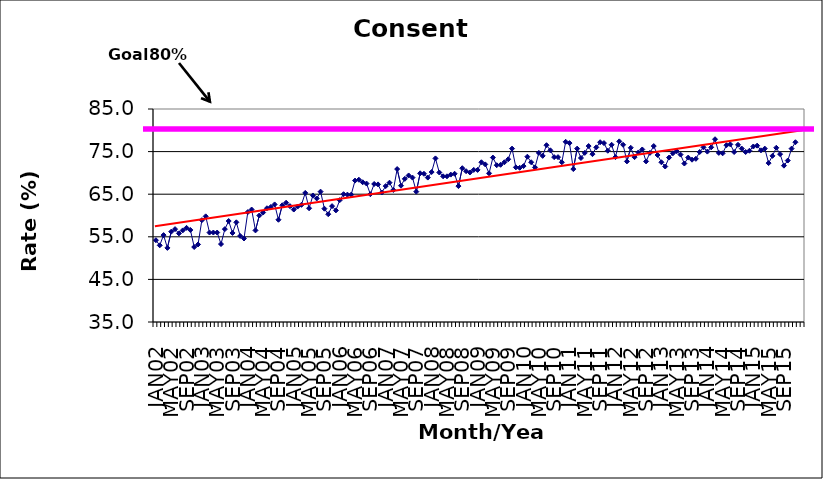
| Category | Series 0 |
|---|---|
| JAN02 | 54.2 |
| FEB02 | 53 |
| MAR02 | 55.4 |
| APR02 | 52.4 |
| MAY02 | 56.2 |
| JUN02 | 56.8 |
| JUL02 | 55.8 |
| AUG02 | 56.5 |
| SEP02 | 57.1 |
| OCT02 | 56.6 |
| NOV02 | 52.6 |
| DEC02 | 53.2 |
| JAN03 | 58.9 |
| FEB03 | 59.8 |
| MAR03 | 56 |
| APR03 | 56 |
| MAY03 | 56 |
| JUN03 | 53.3 |
| JUL03 | 56.8 |
| AUG03 | 58.7 |
| SEP03 | 55.9 |
| OCT03 | 58.4 |
| NOV03 | 55.2 |
| DEC03 | 54.6 |
| JAN04 | 60.8 |
| FEB04 | 61.4 |
| MAR04 | 56.5 |
| APR04 | 60 |
| MAY04 | 60.7 |
| JUN04 | 61.7 |
| JUL04 | 62 |
| AUG04 | 62.6 |
| SEP04 | 59 |
| OCT04 | 62.4 |
| NOV04 | 63 |
| DEC04 | 62.2 |
| JAN05 | 61.4 |
| FEB05 | 62.1 |
| MAR05 | 62.5 |
| APR05 | 65.3 |
| MAY05 | 61.7 |
| JUN05 | 64.7 |
| JUL05 | 64 |
| AUG05 | 65.6 |
| SEP05 | 61.6 |
| OCT05 | 60.3 |
| NOV05 | 62.2 |
| DEC05 | 61.2 |
| JAN06 | 63.6 |
| FEB06 | 65 |
| MAR06 | 64.9 |
| APR06 | 64.9 |
| MAY06 | 68.2 |
| JUN06 | 68.4 |
| JUL06 | 67.8 |
| AUG06 | 67.5 |
| SEP06 | 65 |
| OCT06 | 67.4 |
| NOV06 | 67.3 |
| DEC06 | 65.4 |
| JAN07 | 66.9 |
| FEB07 | 67.7 |
| MAR07 | 66 |
| APR07 | 70.9 |
| MAY07 | 67 |
| JUN07 | 68.6 |
| JUL07 | 69.4 |
| AUG07 | 68.9 |
| SEP07 | 65.6 |
| OCT07 | 69.9 |
| NOV07 | 69.8 |
| DEC07 | 68.9 |
| JAN08 | 70.2 |
| FEB08 | 73.4 |
| MAR08 | 70.1 |
| APR08 | 69.2 |
| MAY08 | 69.2 |
| JUN08 | 69.6 |
| JUL08 | 69.8 |
| AUG08 | 66.9 |
| SEP08 | 71.1 |
| OCT08 | 70.4 |
| NOV08 | 70.1 |
| DEC08 | 70.7 |
| JAN09 | 70.7 |
| FEB09 | 72.5 |
| MAR09 | 72 |
| APR09 | 69.9 |
| MAY09 | 73.6 |
| JUN09 | 71.8 |
| JUL09 | 71.9 |
| AUG09 | 72.5 |
| SEP09 | 73.2 |
| OCT09 | 75.7 |
| NOV09 | 71.3 |
| DEC09 | 71.2 |
| JAN10 | 71.6 |
| FEB10 | 73.8 |
| MAR10 | 72.5 |
| APR10 | 71.3 |
| MAY10 | 74.7 |
| JUN10 | 74 |
| JUL10 | 76.5 |
| AUG10 | 75.3 |
| SEP10 | 73.7 |
| OCT10 | 73.7 |
| NOV10 | 72.5 |
| DEC10 | 77.3 |
| JAN11 | 77 |
| FEB11 | 70.9 |
| MAR11 | 75.7 |
| APR11 | 73.5 |
| MAY11 | 74.7 |
| JUN11 | 76.3 |
| JUL11 | 74.4 |
| AUG11 | 76 |
| SEP11 | 77.2 |
| OCT11 | 77 |
| NOV11 | 75.2 |
| DEC11 | 76.6 |
| JAN12 | 73.7 |
| FEB12 | 77.4 |
| MAR12 | 76.6 |
| APR12 | 72.7 |
| MAY12 | 75.9 |
| JUN12 | 73.7 |
| JUL12 | 74.8 |
| AUG12 | 75.5 |
| SEP12 | 72.7 |
| OCT12 | 74.7 |
| NOV12 | 76.3 |
| DEC12 | 74.2 |
| JAN13 | 72.5 |
| FEB13 | 71.5 |
| MAR13 | 73.6 |
| APR13 | 74.6 |
| MAY13 | 75.1 |
| JUN13 | 74.3 |
| JUL13 | 72.2 |
| AUG13 | 73.6 |
| SEP13 | 73.1 |
| OCT13 | 73.3 |
| NOV13 | 74.9 |
| DEC13 | 76 |
| JAN14 | 75 |
| FEB14 | 76 |
| MAR14 | 77.9 |
| APR14 | 74.7 |
| MAY14 | 74.6 |
| JUN14 | 76.5 |
| JUL14 | 76.7 |
| AUG14 | 74.9 |
| SEP14 | 76.6 |
| OCT14 | 75.7 |
| NOV14 | 74.9 |
| DEC14 | 75.2 |
| JAN15 | 76.2 |
| FEB15 | 76.4 |
| MAR15 | 75.3 |
| APR15 | 75.7 |
| MAY15 | 72.3 |
| JUN15 | 74 |
| JUL15 | 75.9 |
| AUG15 | 74.4 |
| SEP15 | 71.7 |
| OCT15 | 72.9 |
| NOV15 | 75.7 |
| DEC15 | 77.2 |